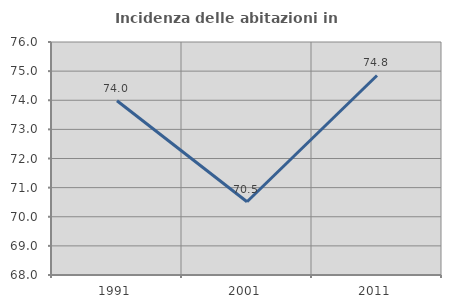
| Category | Incidenza delle abitazioni in proprietà  |
|---|---|
| 1991.0 | 73.981 |
| 2001.0 | 70.516 |
| 2011.0 | 74.85 |